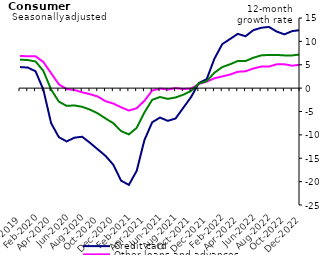
| Category | Credit card | Other loans and advances | Total |
|---|---|---|---|
| Dec-2019 | 4.5 | 6.9 | 6.1 |
| Jan-2020 | 4.4 | 6.8 | 6 |
| Feb-2020 | 3.6 | 6.8 | 5.7 |
| Mar-2020 | -0.3 | 5.6 | 3.7 |
| Apr-2020 | -7.5 | 3.2 | -0.3 |
| May-2020 | -10.5 | 0.8 | -2.9 |
| Jun-2020 | -11.4 | -0.2 | -3.8 |
| Jul-2020 | -10.6 | -0.4 | -3.7 |
| Aug-2020 | -10.4 | -0.9 | -4 |
| Sep-2020 | -11.7 | -1.3 | -4.6 |
| Oct-2020 | -13.1 | -1.8 | -5.4 |
| Nov-2020 | -14.5 | -2.8 | -6.5 |
| Dec-2020 | -16.4 | -3.3 | -7.5 |
| Jan-2021 | -19.8 | -4.1 | -9.2 |
| Feb-2021 | -20.7 | -4.8 | -9.9 |
| Mar-2021 | -17.7 | -4.3 | -8.5 |
| Apr-2021 | -11.1 | -2.7 | -5.2 |
| May-2021 | -7.3 | -0.5 | -2.5 |
| Jun-2021 | -6.3 | -0.1 | -1.9 |
| Jul-2021 | -7 | -0.3 | -2.3 |
| Aug-2021 | -6.5 | 0 | -2 |
| Sep-2021 | -4.2 | -0.2 | -1.4 |
| Oct-2021 | -1.9 | -0.1 | -0.6 |
| Nov-2021 | 1.1 | 0.9 | 1 |
| Dec-2021 | 1.9 | 1.4 | 1.5 |
| Jan-2022 | 6.3 | 2.1 | 3.3 |
| Feb-2022 | 9.4 | 2.5 | 4.5 |
| Mar-2022 | 10.5 | 2.9 | 5.1 |
| Apr-2022 | 11.6 | 3.5 | 5.8 |
| May-2022 | 11.1 | 3.6 | 5.8 |
| Jun-2022 | 12.4 | 4.2 | 6.5 |
| Jul-2022 | 12.9 | 4.6 | 7 |
| Aug-2022 | 13.1 | 4.6 | 7.1 |
| Sep-2022 | 12.1 | 5.1 | 7.1 |
| Oct-2022 | 11.5 | 5.1 | 7 |
| Nov-2022 | 12.2 | 4.8 | 7 |
| Dec-2022 | 12.4 | 5 | 7.2 |